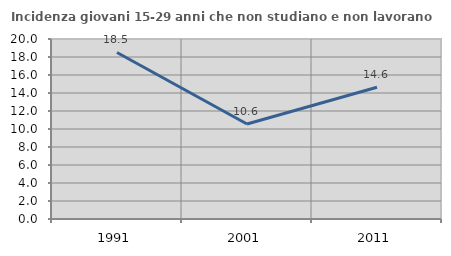
| Category | Incidenza giovani 15-29 anni che non studiano e non lavorano  |
|---|---|
| 1991.0 | 18.505 |
| 2001.0 | 10.561 |
| 2011.0 | 14.634 |